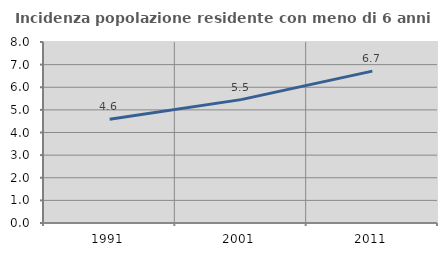
| Category | Incidenza popolazione residente con meno di 6 anni |
|---|---|
| 1991.0 | 4.586 |
| 2001.0 | 5.453 |
| 2011.0 | 6.712 |